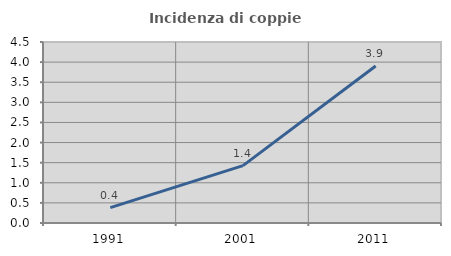
| Category | Incidenza di coppie miste |
|---|---|
| 1991.0 | 0.382 |
| 2001.0 | 1.426 |
| 2011.0 | 3.904 |